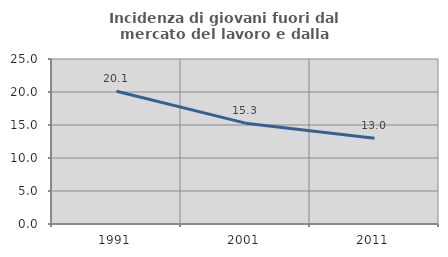
| Category | Incidenza di giovani fuori dal mercato del lavoro e dalla formazione  |
|---|---|
| 1991.0 | 20.12 |
| 2001.0 | 15.28 |
| 2011.0 | 12.994 |